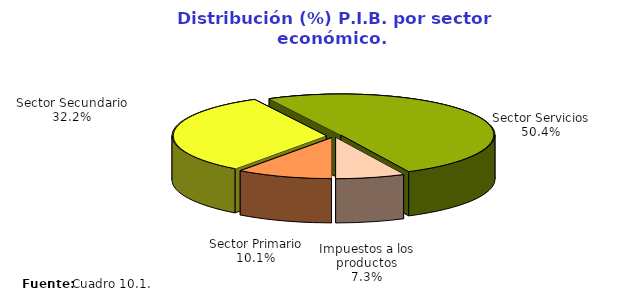
| Category | Series 0 |
|---|---|
| Sector Primario | 23992908.913 |
| Sector Secundario | 76741350.537 |
| Sector Servicios | 120024004.241 |
| Impuestos a los productos | 17295884.008 |